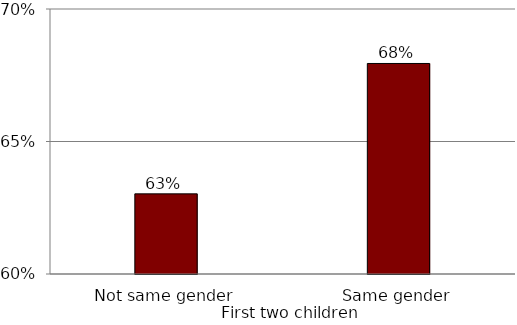
| Category | Probability of more than 3 kids |
|---|---|
| Not same gender | 0.63 |
| Same gender | 0.679 |